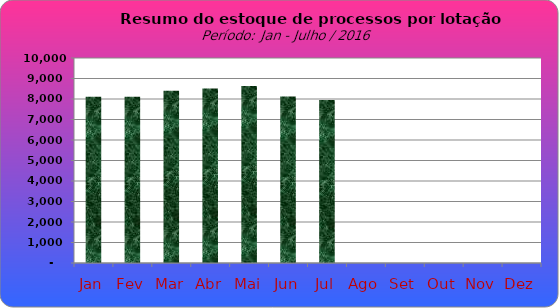
| Category | Series 0 |
|---|---|
| Jan | 8111 |
| Fev | 8114 |
| Mar | 8403 |
| Abr | 8512 |
| Mai | 8633 |
| Jun | 8120 |
| Jul | 7954 |
| Ago | 0 |
| Set | 0 |
| Out | 0 |
| Nov | 0 |
| Dez | 0 |